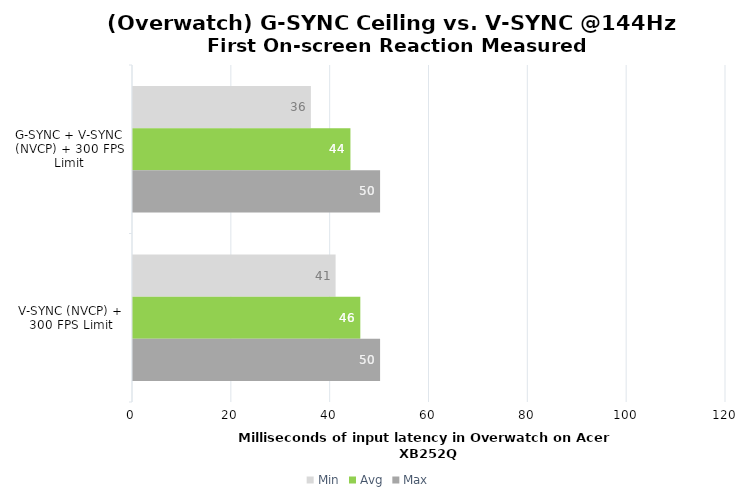
| Category | Min | Avg | Max |
|---|---|---|---|
| G-SYNC + V-SYNC (NVCP) + 300 FPS Limit | 36 | 44 | 50 |
| V-SYNC (NVCP) + 300 FPS Limit | 41 | 46 | 50 |